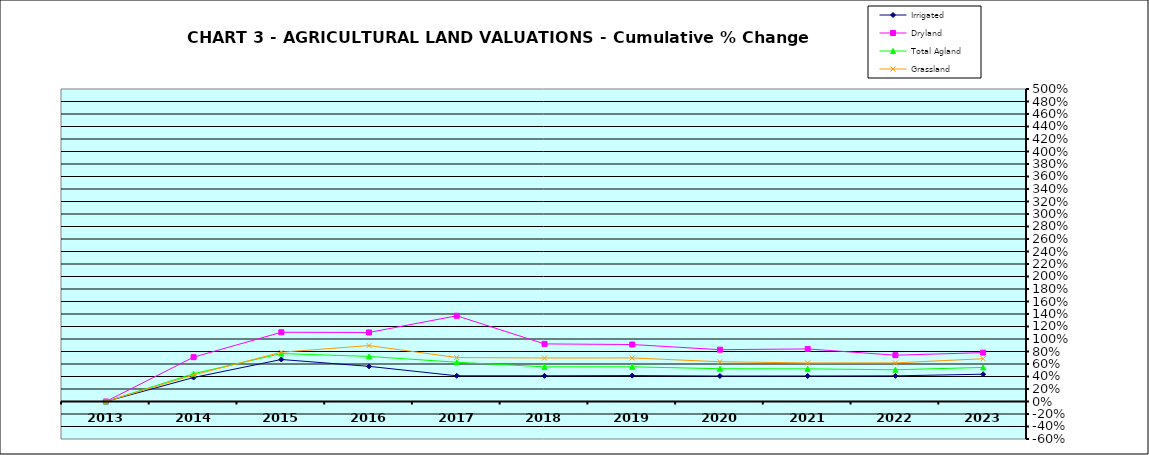
| Category | Irrigated | Dryland | Total Agland | Grassland |
|---|---|---|---|---|
| 2013.0 | 0 | 0 | 0 | 0 |
| 2014.0 | 0.384 | 0.709 | 0.445 | 0.425 |
| 2015.0 | 0.672 | 1.108 | 0.767 | 0.789 |
| 2016.0 | 0.562 | 1.105 | 0.721 | 0.895 |
| 2017.0 | 0.411 | 1.371 | 0.628 | 0.704 |
| 2018.0 | 0.411 | 0.921 | 0.554 | 0.696 |
| 2019.0 | 0.414 | 0.912 | 0.555 | 0.697 |
| 2020.0 | 0.408 | 0.829 | 0.524 | 0.636 |
| 2021.0 | 0.408 | 0.841 | 0.522 | 0.617 |
| 2022.0 | 0.41 | 0.741 | 0.508 | 0.618 |
| 2023.0 | 0.437 | 0.782 | 0.545 | 0.684 |